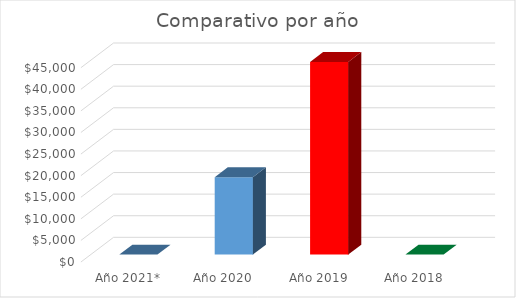
| Category | Series 0 |
|---|---|
| Año 2021* | 0 |
| Año 2020 | 17940.55 |
| Año 2019 | 44624.45 |
| Año 2018 | 0 |